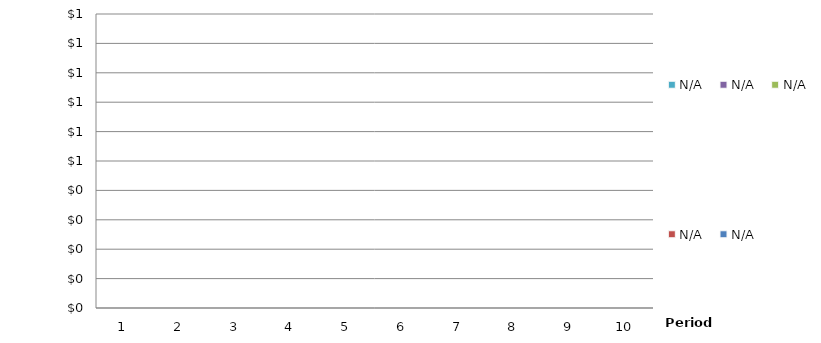
| Category | N/A |
|---|---|
| 0 |  |
| 1 |  |
| 2 |  |
| 3 |  |
| 4 |  |
| 5 |  |
| 6 |  |
| 7 |  |
| 8 |  |
| 9 |  |